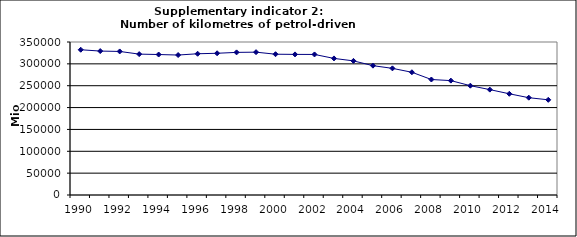
| Category | Number of kilometres of petrol-driven passenger cars, Mio km |
|---|---|
| 1990 | 332283.338 |
| 1991 | 329235.51 |
| 1992 | 328392.619 |
| 1993 | 322280.177 |
| 1994 | 321345.715 |
| 1995 | 320155.36 |
| 1996 | 323093.284 |
| 1997 | 324204.662 |
| 1998 | 326249.238 |
| 1999 | 326734.481 |
| 2000 | 322067.777 |
| 2001 | 321639.376 |
| 2002 | 321536.586 |
| 2003 | 312467.596 |
| 2004 | 306808.486 |
| 2005 | 295877.42 |
| 2006 | 289700.941 |
| 2007 | 280772.088 |
| 2008 | 264202.26 |
| 2009 | 261665.912 |
| 2010 | 250088.049 |
| 2011 | 241077.744 |
| 2012 | 231534.554 |
| 2013 | 222575.844 |
| 2014 | 217756.086 |